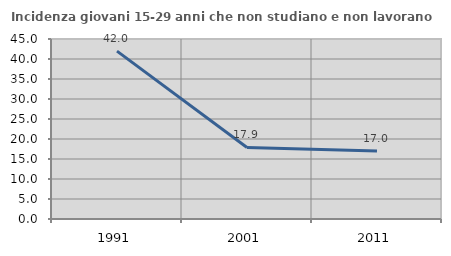
| Category | Incidenza giovani 15-29 anni che non studiano e non lavorano  |
|---|---|
| 1991.0 | 41.969 |
| 2001.0 | 17.889 |
| 2011.0 | 17.002 |